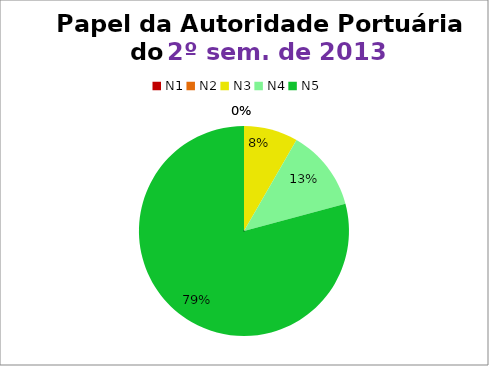
| Category | 2º/13 |
|---|---|
| N1 | 0 |
| N2 | 0 |
| N3 | 2 |
| N4 | 3 |
| N5 | 19 |